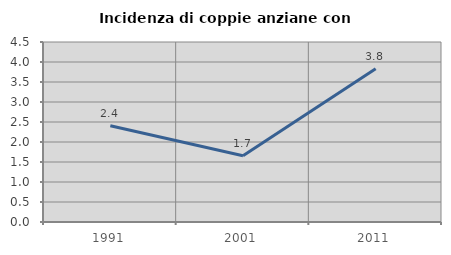
| Category | Incidenza di coppie anziane con figli |
|---|---|
| 1991.0 | 2.405 |
| 2001.0 | 1.655 |
| 2011.0 | 3.833 |